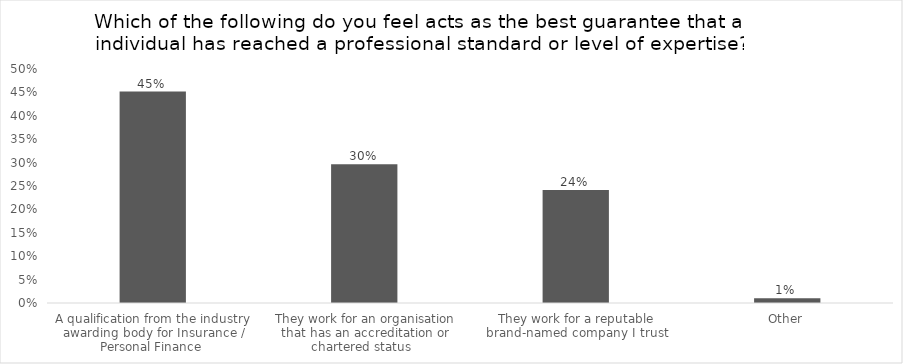
| Category | % of Respondents |
|---|---|
| A qualification from the industry awarding body for Insurance / Personal Finance  | 0.452 |
| They work for an organisation that has an accreditation or chartered status   | 0.297 |
| They work for a reputable brand-named company I trust | 0.241 |
| Other | 0.01 |